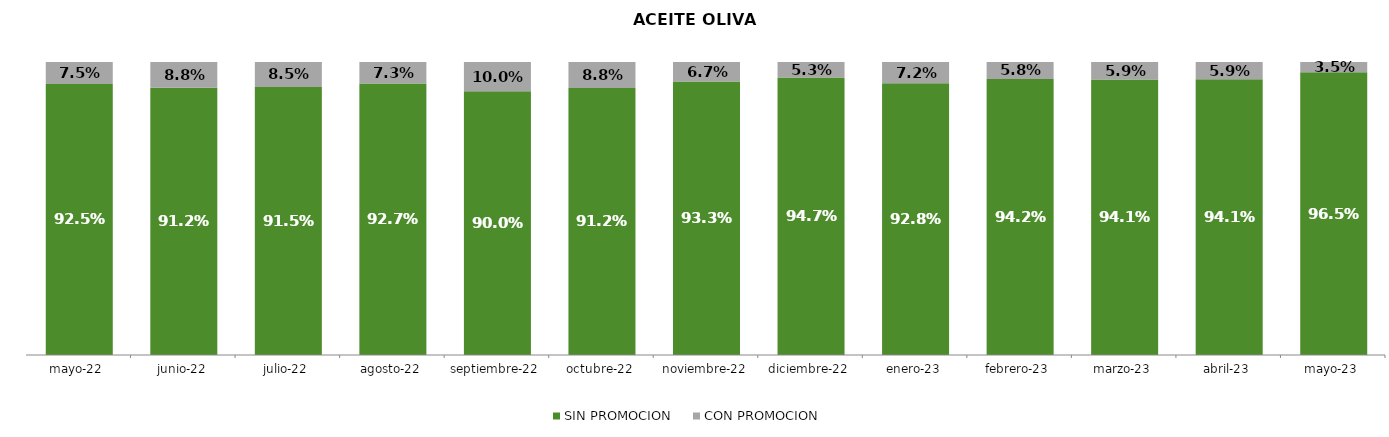
| Category | SIN PROMOCION   | CON PROMOCION   |
|---|---|---|
| 2022-05-01 | 0.925 | 0.075 |
| 2022-06-01 | 0.912 | 0.088 |
| 2022-07-01 | 0.915 | 0.085 |
| 2022-08-01 | 0.927 | 0.073 |
| 2022-09-01 | 0.9 | 0.1 |
| 2022-10-01 | 0.912 | 0.088 |
| 2022-11-01 | 0.933 | 0.067 |
| 2022-12-01 | 0.947 | 0.053 |
| 2023-01-01 | 0.928 | 0.072 |
| 2023-02-01 | 0.942 | 0.058 |
| 2023-03-01 | 0.941 | 0.059 |
| 2023-04-01 | 0.941 | 0.059 |
| 2023-05-01 | 0.965 | 0.035 |